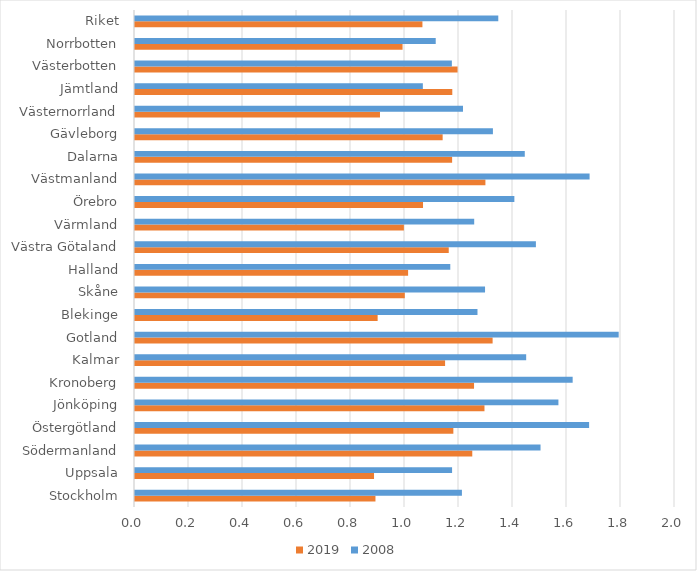
| Category | 2019 | 2008 |
|---|---|---|
| Stockholm | 0.891 | 1.211 |
| Uppsala | 0.885 | 1.174 |
| Södermanland | 1.249 | 1.502 |
| Östergötland | 1.179 | 1.682 |
| Jönköping | 1.294 | 1.568 |
| Kronoberg | 1.256 | 1.621 |
| Kalmar | 1.148 | 1.449 |
| Gotland | 1.324 | 1.791 |
| Blekinge | 0.899 | 1.268 |
| Skåne | 0.999 | 1.296 |
| Halland | 1.011 | 1.168 |
| Västra Götaland | 1.162 | 1.485 |
| Värmland | 0.996 | 1.256 |
| Örebro | 1.067 | 1.405 |
| Västmanland | 1.298 | 1.684 |
| Dalarna | 1.175 | 1.444 |
| Gävleborg | 1.139 | 1.326 |
| Västernorrland | 0.907 | 1.215 |
| Jämtland | 1.175 | 1.066 |
| Västerbotten | 1.195 | 1.174 |
| Norrbotten | 0.991 | 1.114 |
| Riket | 1.065 | 1.346 |